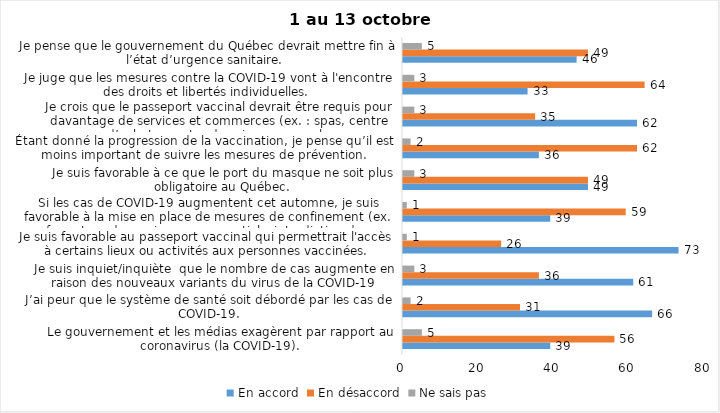
| Category | En accord | En désaccord | Ne sais pas |
|---|---|---|---|
| Le gouvernement et les médias exagèrent par rapport au coronavirus (la COVID-19). | 39 | 56 | 5 |
| J’ai peur que le système de santé soit débordé par les cas de COVID-19. | 66 | 31 | 2 |
| Je suis inquiet/inquiète  que le nombre de cas augmente en raison des nouveaux variants du virus de la COVID-19 | 61 | 36 | 3 |
| Je suis favorable au passeport vaccinal qui permettrait l'accès à certains lieux ou activités aux personnes vaccinées. | 73 | 26 | 1 |
| Si les cas de COVID-19 augmentent cet automne, je suis favorable à la mise en place de mesures de confinement (ex. fermeture de services non essentiels, interdiction des rassemblements privés) | 39 | 59 | 1 |
| Je suis favorable à ce que le port du masque ne soit plus obligatoire au Québec. | 49 | 49 | 3 |
| Étant donné la progression de la vaccination, je pense qu’il est moins important de suivre les mesures de prévention. | 36 | 62 | 2 |
| Je crois que le passeport vaccinal devrait être requis pour davantage de services et commerces (ex. : spas, centre d’achats, centre de soins personnels. | 62 | 35 | 3 |
| Je juge que les mesures contre la COVID-19 vont à l'encontre des droits et libertés individuelles.  | 33 | 64 | 3 |
| Je pense que le gouvernement du Québec devrait mettre fin à l’état d’urgence sanitaire.  | 46 | 49 | 5 |